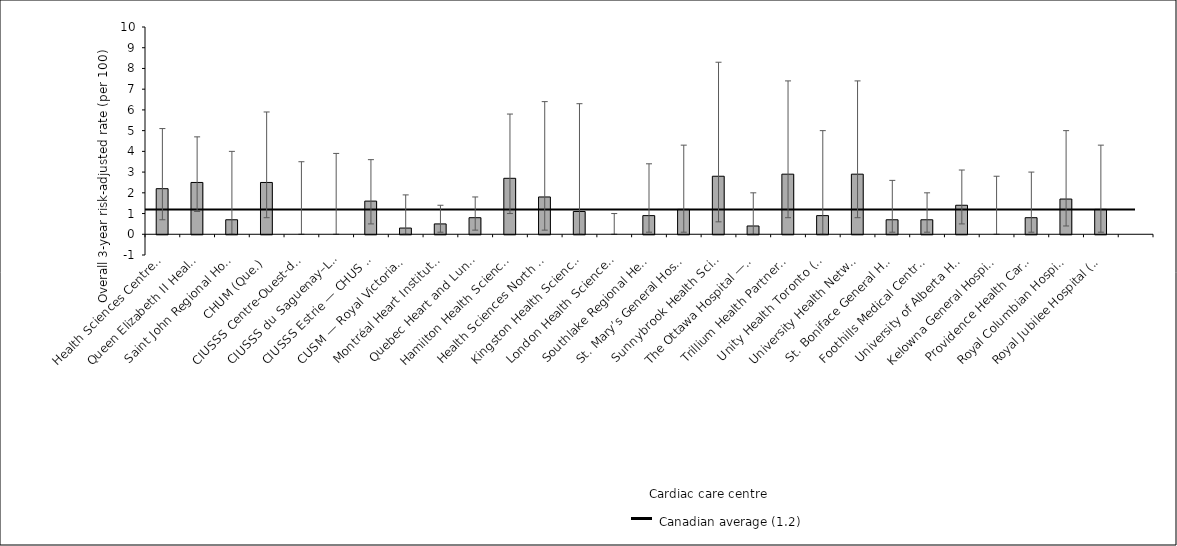
| Category | Risk-adjusted rate |
|---|---|
| Health Sciences Centre, St. John’s (N.L.) | 2.2 |
| Queen Elizabeth II Health Sciences Centre (N.S.) | 2.5 |
| Saint John Regional Hospital (N.B.) | 0.7 |
| CHUM (Que.) | 2.5 |
| CIUSSS Centre-Ouest-de-l’Île-de-Montréal — Jewish General Hospital (Que.) | 0 |
| CIUSSS du Saguenay–Lac-St-Jean — Chicoutimi Hospital (Que.) | 0 |
| CIUSSS Estrie — CHUS — Fleurimont Hospital (Que.) | 1.6 |
| CUSM — Royal Victoria Hospital (Que.) | 0.3 |
| Montréal Heart Institute (Que.) | 0.5 |
| Quebec Heart and Lung Institute (Que.) | 0.8 |
| Hamilton Health Sciences (Ont.) | 2.7 |
| Health Sciences North / Horizon Santé-Nord (Ont.) | 1.8 |
| Kingston Health Sciences Centre (Ont.) | 1.1 |
| London Health Sciences Centre* (Ont.) | 0 |
| Southlake Regional Health Centre (Ont.) | 0.9 |
| St. Mary’s General Hospital (Ont.) | 1.2 |
| Sunnybrook Health Sciences Centre (Ont.) | 2.8 |
| The Ottawa Hospital — University of Ottawa Heart Institute (Ont.) | 0.4 |
| Trillium Health Partners (Ont.) | 2.9 |
| Unity Health Toronto (Ont.) | 0.9 |
| University Health Network (Ont.) | 2.9 |
| St. Boniface General Hospital (Man.) | 0.7 |
| Foothills Medical Centre (Alta.) | 0.7 |
| University of Alberta Hospital (Alta.) | 1.4 |
| Kelowna General Hospital (B.C.) | 0 |
| Providence Health Care — St. Paul’s Hospital (Vancouver) (B.C.) | 0.8 |
| Royal Columbian Hospital (B.C.) | 1.7 |
| Royal Jubilee Hospital (B.C.) | 1.2 |